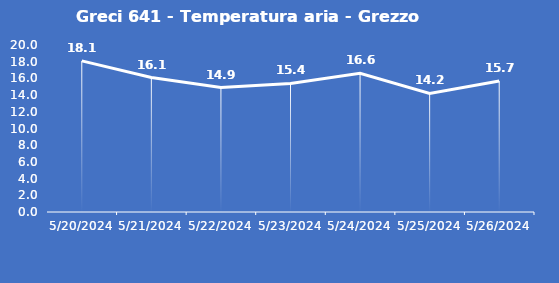
| Category | Greci 641 - Temperatura aria - Grezzo (°C) |
|---|---|
| 5/20/24 | 18.1 |
| 5/21/24 | 16.1 |
| 5/22/24 | 14.9 |
| 5/23/24 | 15.4 |
| 5/24/24 | 16.6 |
| 5/25/24 | 14.2 |
| 5/26/24 | 15.7 |